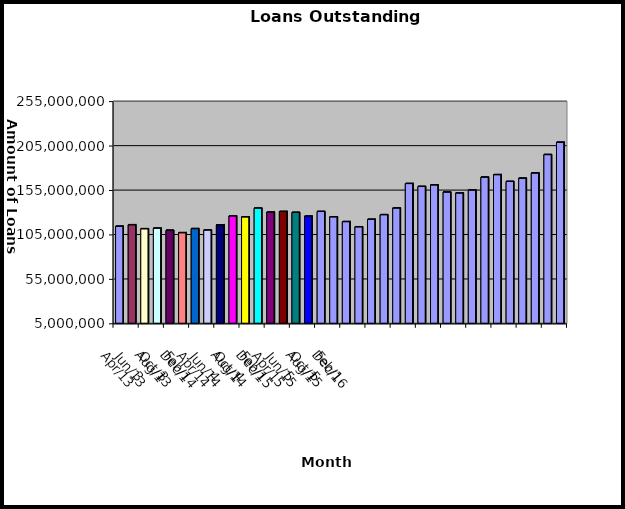
| Category | Series 0 |
|---|---|
| 2013-04-01 | 113953778 |
| 2013-05-01 | 115664498 |
| 2013-06-13 | 111187032 |
| 2013-07-13 | 111829770 |
| 2013-08-13 | 109432378 |
| 2013-09-13 | 106748115 |
| 2013-10-13 | 111324421 |
| 2013-11-13 | 109752085 |
| 2013-12-01 | 115519825 |
| 2014-01-01 | 125648121 |
| 2014-02-02 | 124537582 |
| 2014-03-02 | 134375425 |
| 2014-04-14 | 129844380 |
| 2014-05-14 | 130632499 |
| 2014-06-14 | 129585088 |
| 2014-07-14 | 125293485 |
| 2014-08-14 | 130631598 |
| 2014-09-14 | 124592013 |
| 2014-10-14 | 119206404 |
| 2014-11-14 | 113356255 |
| 2014-12-14 | 121778503 |
| 2015-01-01 | 127010449 |
| 2015-02-01 | 134503017 |
| 2015-03-15 | 162077689 |
| 2015-04-15 | 158777758 |
| 2015-05-15 | 160492433 |
| 2015-06-15 | 152441782 |
| 2015-07-15 | 151403475 |
| 2015-08-15 | 154727666 |
| 2015-09-15 | 169229654 |
| 2015-10-15 | 172040297 |
| 2015-11-15 | 164423383 |
| 2015-12-15 | 168024001 |
| 2016-01-15 | 173896557 |
| 2016-02-16 | 194645171 |
| 2016-03-16 | 208439304 |